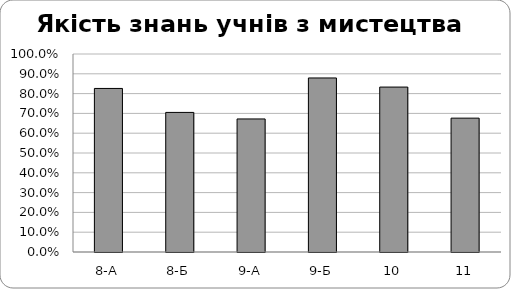
| Category | Series 0 |
|---|---|
| 8-А | 0.826 |
| 8-Б | 0.705 |
| 9-А | 0.672 |
| 9-Б | 0.879 |
| 10 | 0.833 |
| 11 | 0.676 |